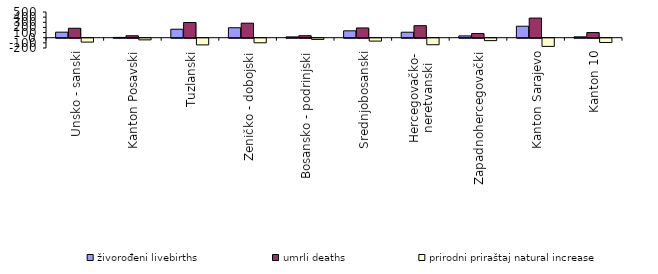
| Category | živorođeni livebirths | umrli deaths | prirodni priraštaj natural increase |
|---|---|---|---|
| Unsko - sanski | 108 | 184 | -76 |
| Kanton Posavski | 6 | 38 | -32 |
| Tuzlanski | 165 | 295 | -130 |
| Zeničko - dobojski | 194 | 283 | -89 |
| Bosansko - podrinjski | 16 | 39 | -23 |
| Srednjobosanski | 134 | 190 | -56 |
| Hercegovačko-
neretvanski | 107 | 234 | -127 |
| Zapadnohercegovački | 35 | 82 | -47 |
| Kanton Sarajevo | 223 | 382 | -159 |
| Kanton 10 | 17 | 100 | -83 |